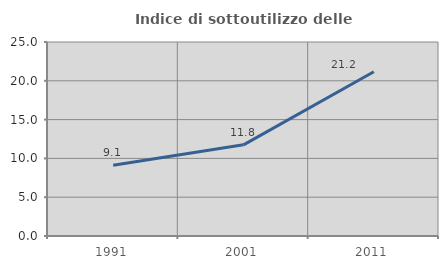
| Category | Indice di sottoutilizzo delle abitazioni  |
|---|---|
| 1991.0 | 9.112 |
| 2001.0 | 11.75 |
| 2011.0 | 21.158 |